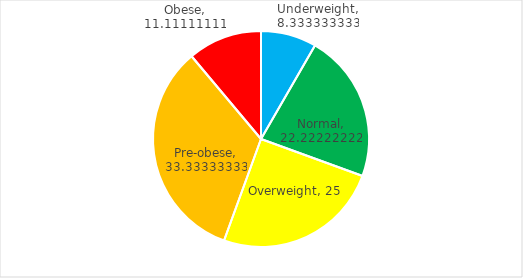
| Category | Women |
|---|---|
| Underweight | 8.333 |
| Normal | 22.222 |
| Overweight | 25 |
| Pre-obese | 33.333 |
| Obese | 11.111 |